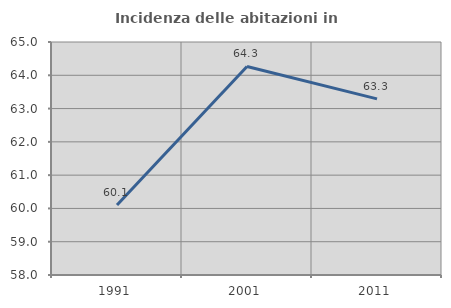
| Category | Incidenza delle abitazioni in proprietà  |
|---|---|
| 1991.0 | 60.103 |
| 2001.0 | 64.265 |
| 2011.0 | 63.292 |